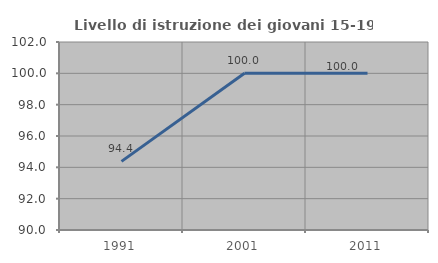
| Category | Livello di istruzione dei giovani 15-19 anni |
|---|---|
| 1991.0 | 94.382 |
| 2001.0 | 100 |
| 2011.0 | 100 |